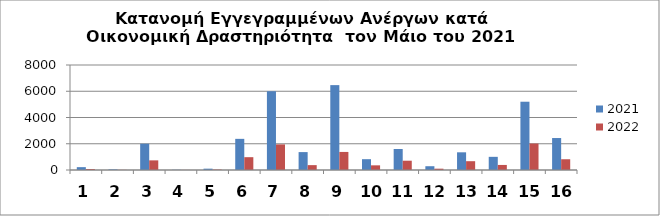
| Category | 2021 | 2022 |
|---|---|---|
| 0 | 217 | 73 |
| 1 | 46 | 11 |
| 2 | 2002 | 734 |
| 3 | 16 | 5 |
| 4 | 101 | 34 |
| 5 | 2373 | 977 |
| 6 | 6002 | 1950 |
| 7 | 1364 | 371 |
| 8 | 6467 | 1376 |
| 9 | 824 | 355 |
| 10 | 1598 | 708 |
| 11 | 288 | 100 |
| 12 | 1348 | 671 |
| 13 | 1003 | 385 |
| 14 | 5202 | 2017 |
| 15 | 2436 | 819 |